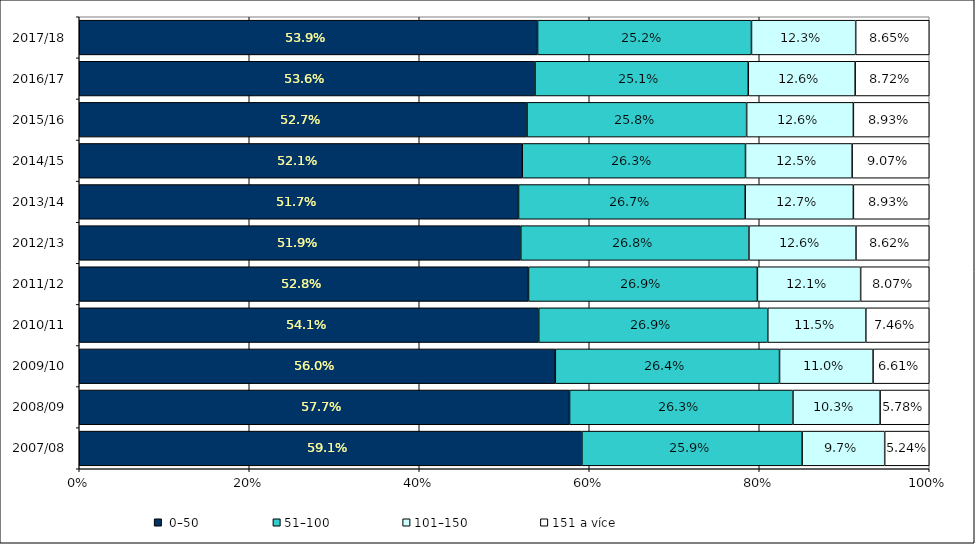
| Category |  0–50 | 51–100 | 101–150 | 151 a více |
|---|---|---|---|---|
| 2007/08 | 0.591 | 0.259 | 0.097 | 0.052 |
| 2008/09 | 0.577 | 0.263 | 0.103 | 0.058 |
| 2009/10 | 0.56 | 0.264 | 0.11 | 0.066 |
| 2010/11 | 0.541 | 0.269 | 0.115 | 0.075 |
| 2011/12 | 0.528 | 0.269 | 0.121 | 0.081 |
| 2012/13 | 0.519 | 0.268 | 0.126 | 0.086 |
| 2013/14 | 0.517 | 0.267 | 0.127 | 0.089 |
| 2014/15 | 0.521 | 0.263 | 0.125 | 0.091 |
| 2015/16 | 0.527 | 0.258 | 0.126 | 0.089 |
| 2016/17 | 0.536 | 0.251 | 0.126 | 0.087 |
| 2017/18 | 0.539 | 0.252 | 0.123 | 0.087 |